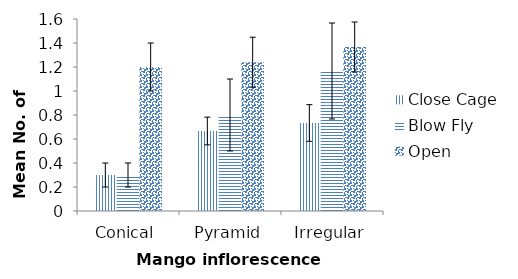
| Category | Close Cage | Blow Fly | Open |
|---|---|---|---|
| Conical | 0.3 | 0.3 | 1.2 |
| Pyramid | 0.667 | 0.8 | 1.24 |
| Irregular | 0.733 | 1.167 | 1.367 |